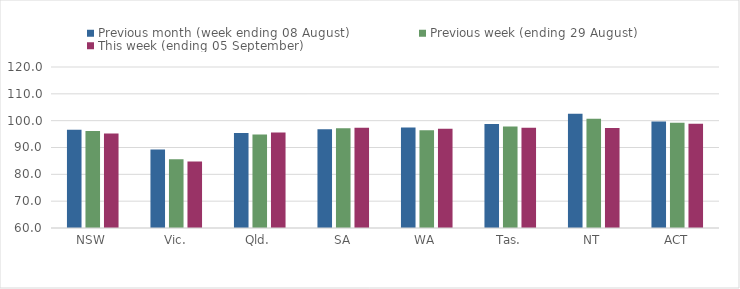
| Category | Previous month (week ending 08 August) | Previous week (ending 29 August) | This week (ending 05 September) |
|---|---|---|---|
| NSW | 96.66 | 96.11 | 95.25 |
| Vic. | 89.27 | 85.65 | 84.79 |
| Qld. | 95.42 | 94.82 | 95.61 |
| SA | 96.83 | 97.17 | 97.37 |
| WA | 97.43 | 96.43 | 96.95 |
| Tas. | 98.74 | 97.87 | 97.4 |
| NT | 102.61 | 100.73 | 97.29 |
| ACT | 99.68 | 99.22 | 98.86 |